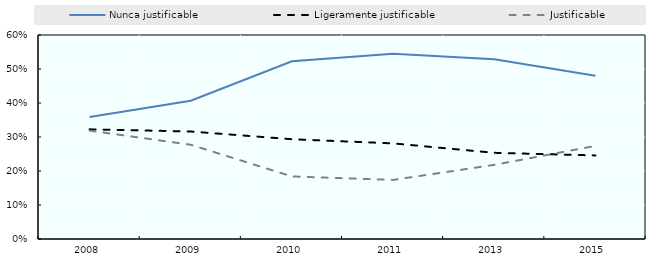
| Category | Nunca justificable | Ligeramente justificable | Justificable |
|---|---|---|---|
| 2008.0 | 0.359 | 0.323 | 0.319 |
| 2009.0 | 0.407 | 0.316 | 0.277 |
| 2010.0 | 0.523 | 0.293 | 0.184 |
| 2011.0 | 0.545 | 0.281 | 0.174 |
| 2013.0 | 0.528 | 0.253 | 0.218 |
| 2015.0 | 0.48 | 0.246 | 0.274 |